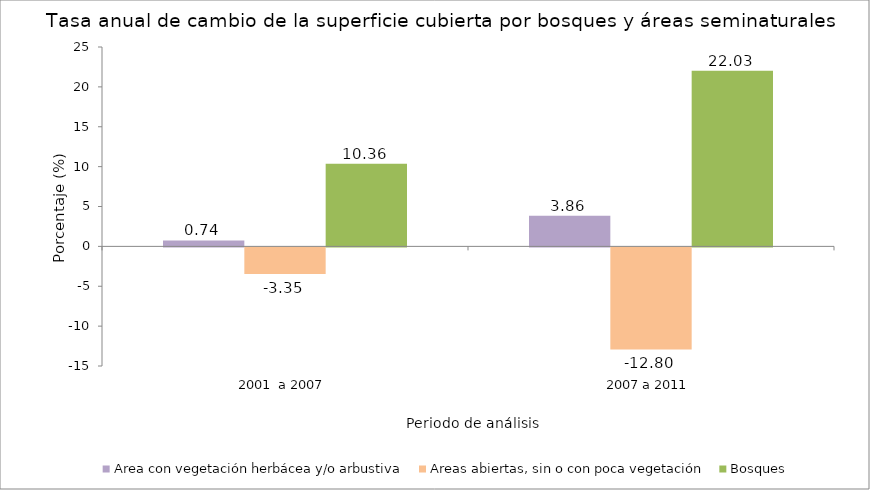
| Category | Area con vegetación herbácea y/o arbustiva | Areas abiertas, sin o con poca vegetación | Bosques |
|---|---|---|---|
| 2001  a 2007 | 0.737 | -3.346 | 10.364 |
| 2007 a 2011 | 3.856 | -12.798 | 22.03 |